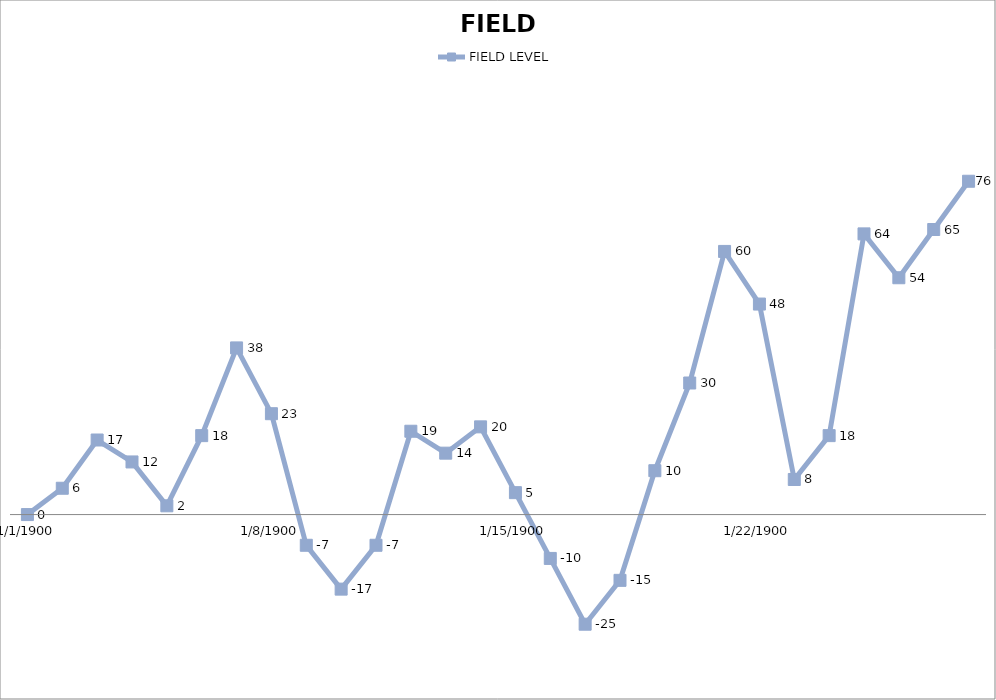
| Category | FIELD LEVEL |
|---|---|
| 0 | 0 |
| 1 | 6 |
| 2 | 17 |
| 3 | 12 |
| 4 | 2 |
| 5 | 18 |
| 6 | 38 |
| 7 | 23 |
| 8 | -7 |
| 9 | -17 |
| 10 | -7 |
| 11 | 19 |
| 12 | 14 |
| 13 | 20 |
| 14 | 5 |
| 15 | -10 |
| 16 | -25 |
| 17 | -15 |
| 18 | 10 |
| 19 | 30 |
| 20 | 60 |
| 21 | 48 |
| 22 | 8 |
| 23 | 18 |
| 24 | 64 |
| 25 | 54 |
| 26 | 65 |
| 27 | 76 |